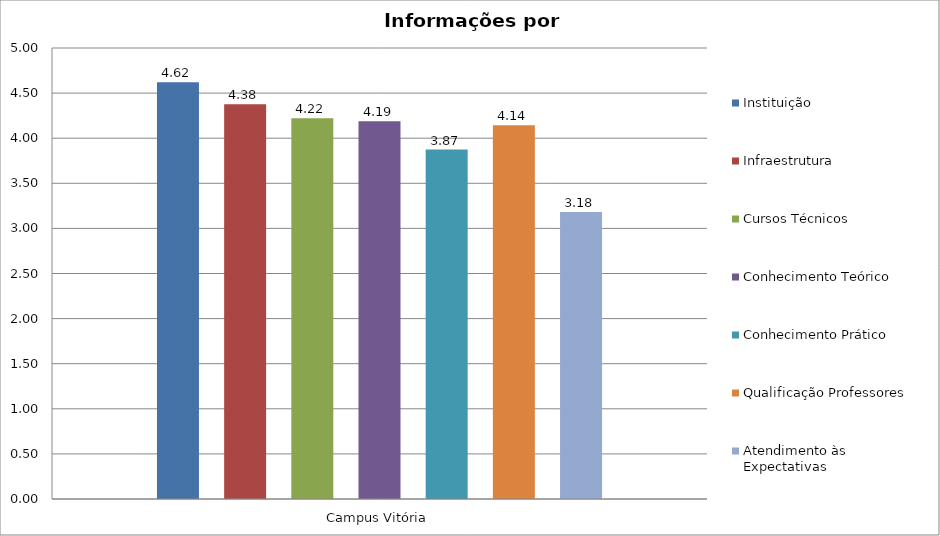
| Category | Instituição | Infraestrutura | Cursos Técnicos | Conhecimento Teórico | Conhecimento Prático | Qualificação Professores | Atendimento às Expectativas |
|---|---|---|---|---|---|---|---|
| Campus Vitória | 4.62 | 4.377 | 4.22 | 4.189 | 3.874 | 4.145 | 3.181 |